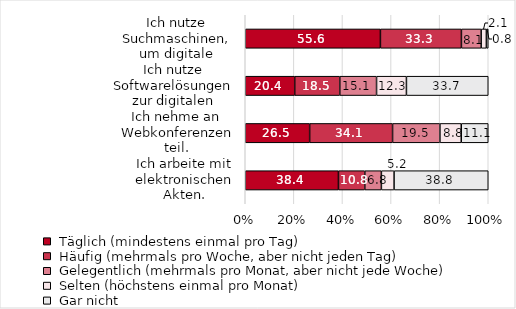
| Category | Series 0 | Series 1 | Series 2 | Series 3 | Series 4 |
|---|---|---|---|---|---|
| Ich arbeite mit elektronischen Akten. | 38.353 | 10.843 | 6.827 | 5.221 | 38.755 |
| Ich nehme an Webkonferenzen teil. | 26.511 | 34.113 | 19.493 | 8.772 | 11.111 |
| Ich nutze Softwarelösungen zur digitalen Zusammenarbeit mit Kolleg:innen. | 20.363 | 18.548 | 15.121 | 12.298 | 33.669 |
| Ich nutze Suchmaschinen, um digitale Informationen zu finden. | 55.62 | 33.333 | 8.14 | 2.132 | 0.775 |